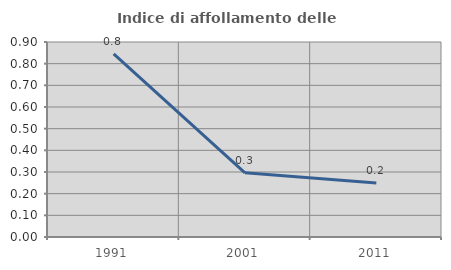
| Category | Indice di affollamento delle abitazioni  |
|---|---|
| 1991.0 | 0.845 |
| 2001.0 | 0.296 |
| 2011.0 | 0.25 |